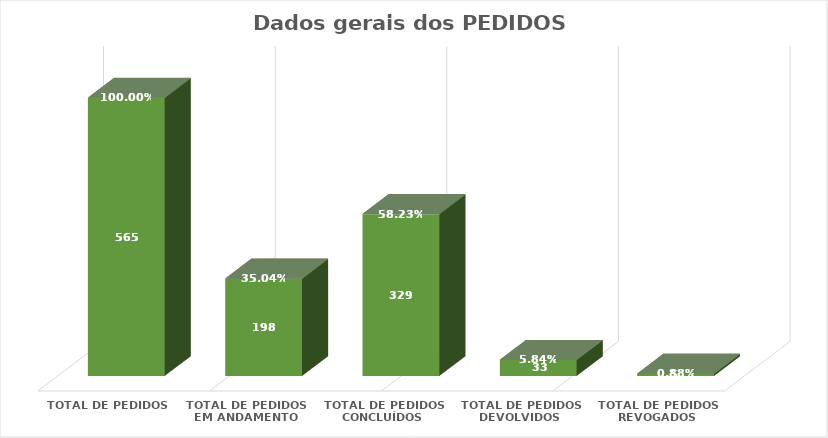
| Category | Series 0 | Series 1 |
|---|---|---|
| Total de pedidos | 565 | 1 |
| Total de pedidos em andamento | 198 | 0.35 |
| Total de pedidos concluídos | 329 | 0.582 |
| Total de pedidos devolvidos | 33 | 0.058 |
| Total de pedidos revogados | 5 | 0.009 |